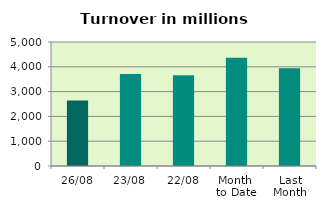
| Category | Series 0 |
|---|---|
| 26/08 | 2643.571 |
| 23/08 | 3712.986 |
| 22/08 | 3656.035 |
| Month 
to Date | 4369.597 |
| Last
Month | 3946.236 |